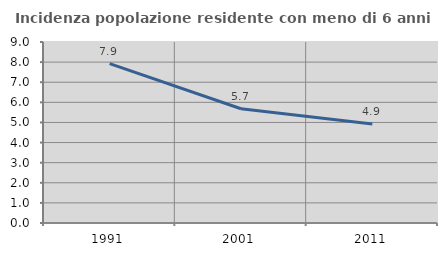
| Category | Incidenza popolazione residente con meno di 6 anni |
|---|---|
| 1991.0 | 7.921 |
| 2001.0 | 5.683 |
| 2011.0 | 4.926 |